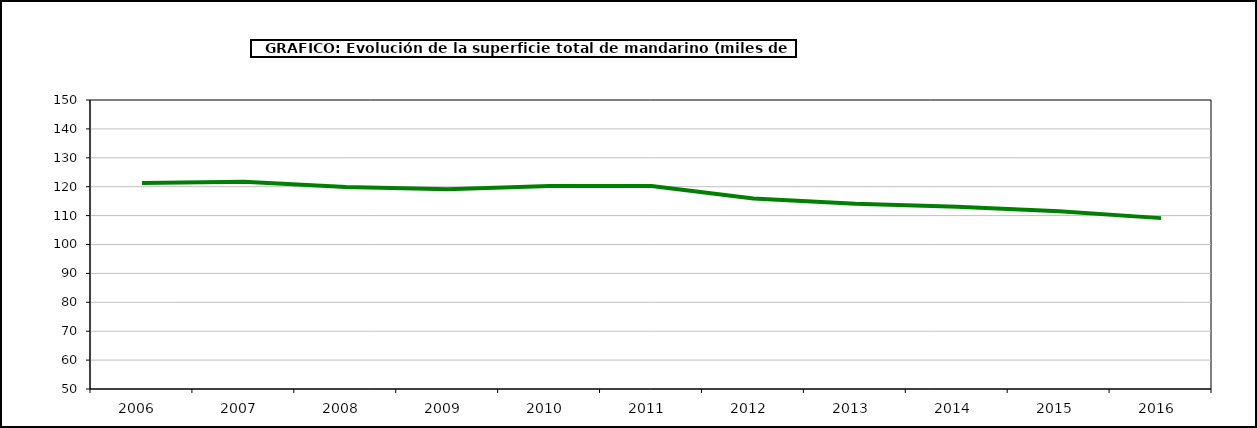
| Category | superficie |
|---|---|
| 2006.0 | 121.292 |
| 2007.0 | 121.727 |
| 2008.0 | 119.875 |
| 2009.0 | 119.154 |
| 2010.0 | 120.256 |
| 2011.0 | 120.212 |
| 2012.0 | 115.927 |
| 2013.0 | 114.076 |
| 2014.0 | 113.102 |
| 2015.0 | 111.467 |
| 2016.0 | 109.127 |